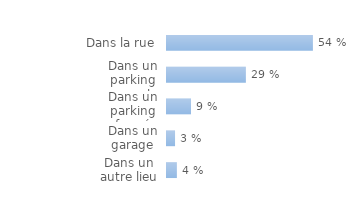
| Category | Series 0 |
|---|---|
| Dans un autre lieu | 0.037 |
| Dans un garage | 0.03 |
| Dans un parking fermé | 0.089 |
| Dans un parking ouvert | 0.294 |
| Dans la rue | 0.544 |